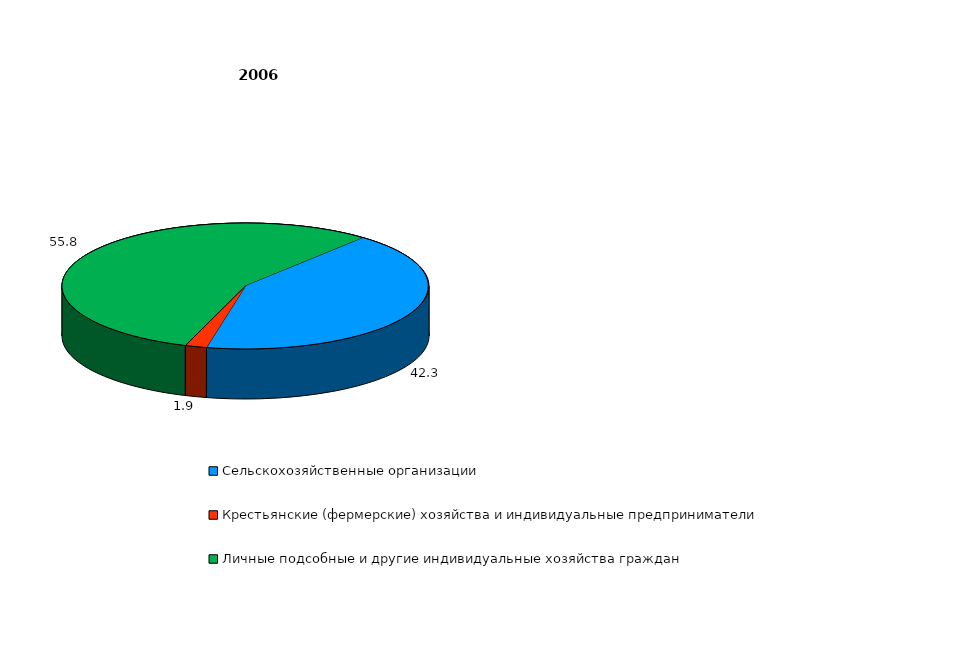
| Category | Series 0 |
|---|---|
| Сельскохозяйственные организации  | 42.3 |
| Крестьянские (фермерские) хозяйства и индивидуальные предприниматели  | 1.9 |
| Личные подсобные и другие индивидуальные хозяйства граждан  | 55.8 |